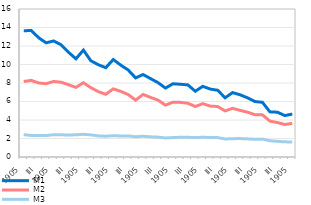
| Category | M1 | M2 | M3 |
|---|---|---|---|
| 2012 | 13.639 | 8.164 | 2.423 |
| II | 13.689 | 8.283 | 2.318 |
| III | 12.893 | 8.004 | 2.327 |
| IV | 12.342 | 7.926 | 2.321 |
| 2013 | 12.547 | 8.164 | 2.409 |
| II | 12.14 | 8.086 | 2.399 |
| III | 11.324 | 7.815 | 2.38 |
| IV | 10.614 | 7.526 | 2.4 |
| 2014 | 11.557 | 8.031 | 2.452 |
| II | 10.403 | 7.493 | 2.391 |
| III | 9.972 | 7.067 | 2.282 |
| IV | 9.656 | 6.777 | 2.251 |
| 2015 | 10.539 | 7.363 | 2.3 |
| II | 9.933 | 7.097 | 2.275 |
| III | 9.408 | 6.752 | 2.281 |
| IV | 8.554 | 6.143 | 2.191 |
| 2016 | 8.914 | 6.764 | 2.241 |
| II | 8.476 | 6.441 | 2.181 |
| III | 8.039 | 6.151 | 2.143 |
| IV | 7.449 | 5.602 | 2.061 |
| 2017 | 7.914 | 5.927 | 2.098 |
| II | 7.864 | 5.906 | 2.134 |
| III | 7.796 | 5.812 | 2.131 |
| IV | 7.109 | 5.459 | 2.092 |
| 2018 | 7.639 | 5.765 | 2.144 |
| II | 7.345 | 5.506 | 2.096 |
| III | 7.214 | 5.455 | 2.097 |
| IV | 6.403 | 4.984 | 1.947 |
| 2019 | 6.962 | 5.26 | 1.981 |
| II | 6.724 | 5.045 | 1.993 |
| III | 6.399 | 4.846 | 1.962 |
| IV | 5.996 | 4.566 | 1.919 |
| 2020 | 5.913 | 4.555 | 1.934 |
| II | 4.881 | 3.881 | 1.754 |
| III | 4.844 | 3.723 | 1.699 |
| IV | 4.478 | 3.516 | 1.638 |
| 2021 | 4.641 | 3.635 | 1.627 |